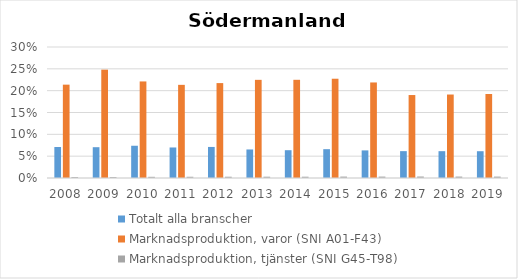
| Category | Totalt alla branscher | Marknadsproduktion, varor (SNI A01-F43) | Marknadsproduktion, tjänster (SNI G45-T98) |
|---|---|---|---|
| 2008 | 0.071 | 0.214 | 0.002 |
| 2009 | 0.071 | 0.248 | 0.002 |
| 2010 | 0.074 | 0.221 | 0.003 |
| 2011 | 0.07 | 0.213 | 0.003 |
| 2012 | 0.071 | 0.217 | 0.003 |
| 2013 | 0.065 | 0.225 | 0.003 |
| 2014 | 0.064 | 0.225 | 0.003 |
| 2015 | 0.066 | 0.227 | 0.003 |
| 2016 | 0.063 | 0.219 | 0.003 |
| 2017 | 0.062 | 0.19 | 0.003 |
| 2018 | 0.061 | 0.191 | 0.003 |
| 2019 | 0.061 | 0.192 | 0.003 |